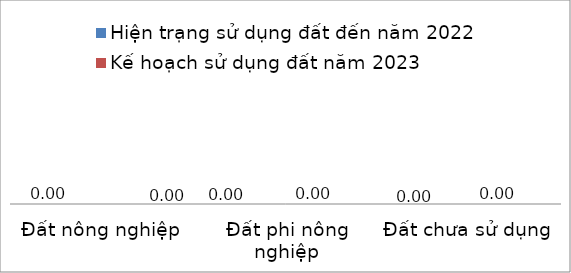
| Category | Hiện trạng sử dụng đất đến năm 2022 | Kế hoạch sử dụng đất năm 2023 |
|---|---|---|
| Đất nông nghiệp | 0 | 0 |
| Đất phi nông nghiệp | 0 | 0 |
| Đất chưa sử dụng | 0 | 0 |